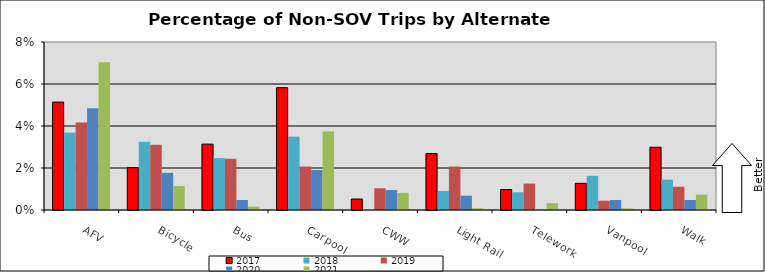
| Category | 2017 | 2018 | 2019 | 2020 | 2021 |
|---|---|---|---|---|---|
| AFV | 0.051 | 0.037 | 0.042 | 0.049 | 0.07 |
| Bicycle | 0.02 | 0.033 | 0.031 | 0.018 | 0.011 |
| Bus | 0.031 | 0.025 | 0.024 | 0.005 | 0.002 |
| Carpool | 0.058 | 0.035 | 0.021 | 0.019 | 0.037 |
| CWW | 0.005 | 0 | 0.01 | 0.01 | 0.008 |
| Light Rail | 0.027 | 0.009 | 0.021 | 0.007 | 0.001 |
| Telework | 0.01 | 0.008 | 0.013 | 0 | 0.003 |
| Vanpool | 0.013 | 0.016 | 0.004 | 0.005 | 0.001 |
| Walk | 0.03 | 0.014 | 0.011 | 0.005 | 0.007 |